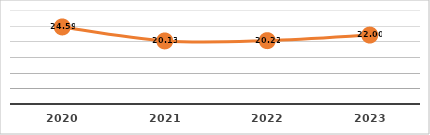
| Category | REPROBACIÓN (%)
PRIMER SEMESTRE, EJERCICIO 2023

 |
|---|---|
| 2020.0 | 24.59 |
| 2021.0 | 20.13 |
| 2022.0 | 20.22 |
| 2023.0 | 22 |